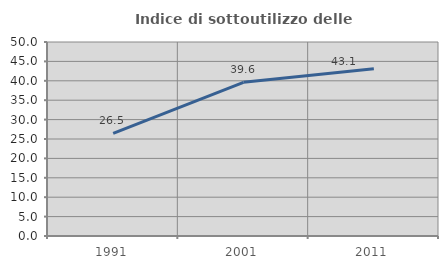
| Category | Indice di sottoutilizzo delle abitazioni  |
|---|---|
| 1991.0 | 26.462 |
| 2001.0 | 39.612 |
| 2011.0 | 43.112 |